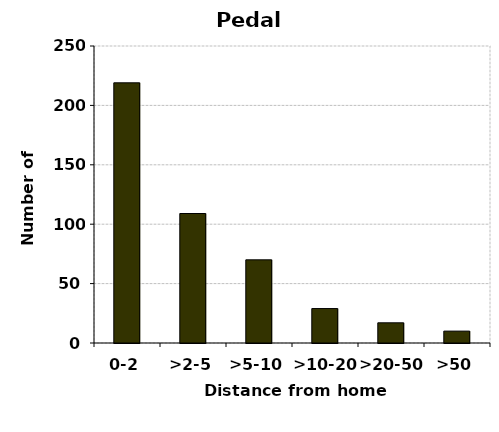
| Category | Pedal cycles |
|---|---|
| 0-2 | 219 |
| >2-5 | 109 |
| >5-10 | 70 |
| >10-20 | 29 |
| >20-50 | 17 |
| >50 | 10 |